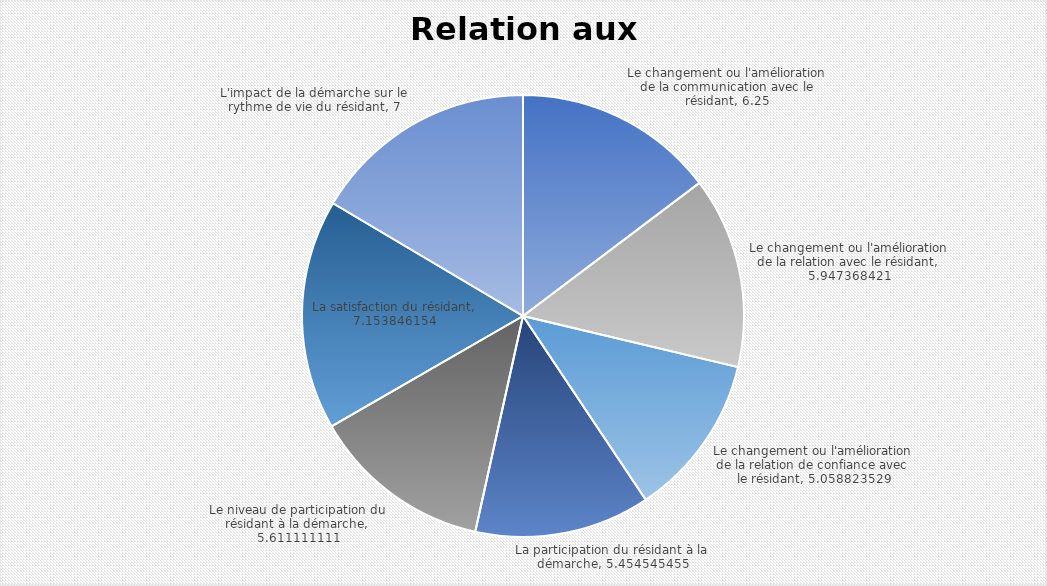
| Category | Series 0 |
|---|---|
| Le changement ou l'amélioration de la communication avec le résidant | 6.25 |
| Le changement ou l'amélioration de la relation avec le résidant | 5.947 |
| Le changement ou l'amélioration de la relation de confiance avec le résidant | 5.059 |
| La participation du résidant à la démarche | 5.455 |
| Le niveau de participation du résidant à la démarche | 5.611 |
| La satisfaction du résidant | 7.154 |
| L'impact de la démarche sur le rythme de vie du résidant | 7 |